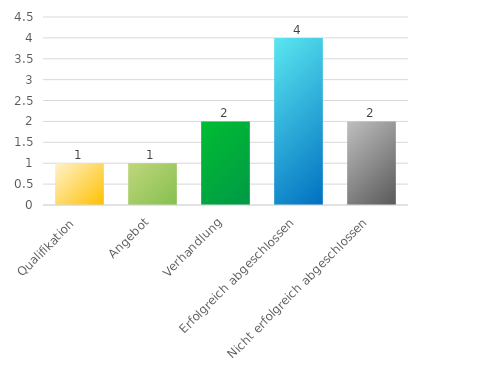
| Category | Series 0 |
|---|---|
| Qualifikation | 1 |
| Angebot | 1 |
| Verhandlung | 2 |
| Erfolgreich abgeschlossen | 4 |
| Nicht erfolgreich abgeschlossen | 2 |